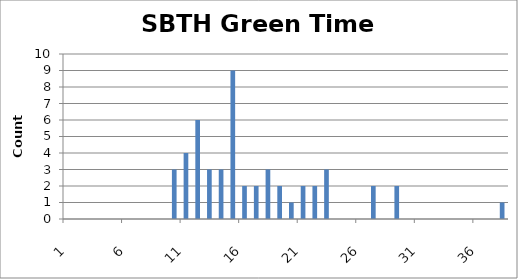
| Category | Series 0 |
|---|---|
| 0 | 0 |
| 1 | 0 |
| 2 | 0 |
| 3 | 0 |
| 4 | 0 |
| 5 | 0 |
| 6 | 0 |
| 7 | 0 |
| 8 | 0 |
| 9 | 3 |
| 10 | 4 |
| 11 | 6 |
| 12 | 3 |
| 13 | 3 |
| 14 | 9 |
| 15 | 2 |
| 16 | 2 |
| 17 | 3 |
| 18 | 2 |
| 19 | 1 |
| 20 | 2 |
| 21 | 2 |
| 22 | 3 |
| 23 | 0 |
| 24 | 0 |
| 25 | 0 |
| 26 | 2 |
| 27 | 0 |
| 28 | 2 |
| 29 | 0 |
| 30 | 0 |
| 31 | 0 |
| 32 | 0 |
| 33 | 0 |
| 34 | 0 |
| 35 | 0 |
| 36 | 0 |
| 37 | 1 |